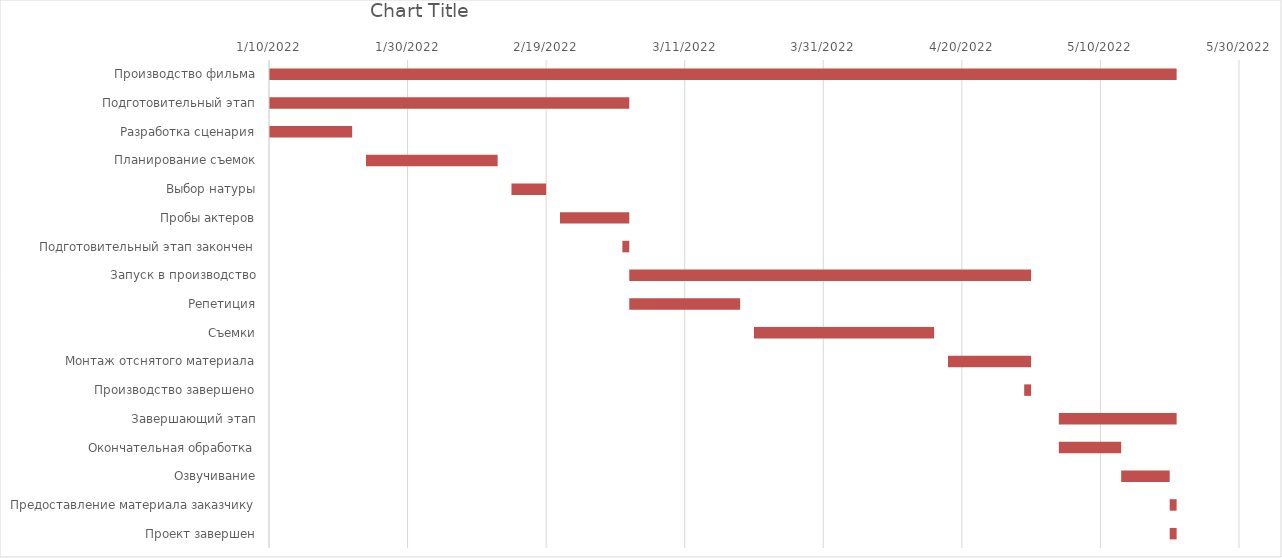
| Category | Series 0 | Series 1 |
|---|---|---|
| Производство фильма | 1/10/22 | 131 |
| Подготовительный этап | 1/10/22 | 52 |
| Разработка сценария | 1/10/22 | 12 |
| Планирование съемок | 1/24/22 | 19 |
| Выбор натуры | 2/14/22 | 5 |
| Пробы актеров | 2/21/22 | 10 |
| Подготовительный этап закончен | 3/2/22 | 1 |
| Запуск в производство | 3/3/22 | 58 |
| Репетиция | 3/3/22 | 16 |
| Съемки | 3/21/22 | 26 |
| Монтаж отснятого материала | 4/18/22 | 12 |
| Производство завершено | 4/29/22 | 1 |
| Завершающий этап | 5/4/22 | 17 |
| Окончательная обработка | 5/4/22 | 9 |
| Озвучивание | 5/13/22 | 7 |
| Предоставление материала заказчику | 5/20/22 | 1 |
| Проект завершен | 5/20/22 | 1 |